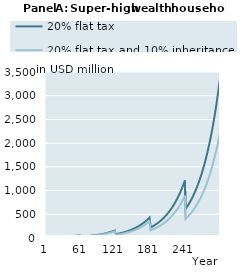
| Category | 20% flat tax | 20% flat tax and 10% inheritance tax |
|---|---|---|
| 1 | 10000000 | 10000000 |
| 2 | 10314750 | 10314750 |
| 3 | 10638690.7 | 10638690.7 |
| 4 | 10972090.468 | 10972090.468 |
| 5 | 11315225.51 | 11315225.51 |
| 6 | 11668380.095 | 11668380.095 |
| 7 | 12031846.794 | 12031846.794 |
| 8 | 12405926.72 | 12405926.72 |
| 9 | 12790929.78 | 12790929.78 |
| 10 | 13187174.93 | 13187174.93 |
| 11 | 13594990.438 | 13594990.438 |
| 12 | 14014714.159 | 14014714.159 |
| 13 | 14446693.812 | 14446693.812 |
| 14 | 14891287.271 | 14891287.271 |
| 15 | 15348862.86 | 15348862.86 |
| 16 | 15819799.655 | 15819799.655 |
| 17 | 16304487.805 | 16304487.805 |
| 18 | 16803328.849 | 16803328.849 |
| 19 | 17316736.052 | 17316736.052 |
| 20 | 17845134.744 | 17845134.744 |
| 21 | 18388962.679 | 18388962.679 |
| 22 | 18948670.389 | 18948670.389 |
| 23 | 19524721.564 | 19524721.564 |
| 24 | 20117593.434 | 20117593.434 |
| 25 | 20727777.162 | 20727777.162 |
| 26 | 21355778.255 | 21355778.255 |
| 27 | 22002116.981 | 22002116.981 |
| 28 | 22667328.796 | 22667328.796 |
| 29 | 23351964.797 | 23351964.797 |
| 30 | 24056592.169 | 24056592.169 |
| 31 | 24781794.661 | 24781794.661 |
| 32 | 25528173.065 | 25528173.065 |
| 33 | 26296345.718 | 26296345.718 |
| 34 | 27086949.013 | 27086949.013 |
| 35 | 27900637.924 | 27900637.924 |
| 36 | 28738086.552 | 28738086.552 |
| 37 | 29599988.679 | 29599988.679 |
| 38 | 30487058.349 | 30487058.349 |
| 39 | 31400030.452 | 31400030.452 |
| 40 | 32339661.341 | 32339661.341 |
| 41 | 33306729.453 | 33306729.453 |
| 42 | 34290485.953 | 34290485.953 |
| 43 | 35302968.142 | 35302968.142 |
| 44 | 36345014.812 | 36345014.812 |
| 45 | 37417489.245 | 37417489.245 |
| 46 | 38521279.931 | 38521279.931 |
| 47 | 39657301.305 | 39657301.305 |
| 48 | 40826494.503 | 40826494.503 |
| 49 | 42029828.142 | 42029828.142 |
| 50 | 43268299.124 | 43268299.124 |
| 51 | 44542933.458 | 44542933.458 |
| 52 | 45854787.115 | 45854787.115 |
| 53 | 47204946.899 | 47204946.899 |
| 54 | 48594531.349 | 48594531.349 |
| 55 | 50024691.664 | 50024691.664 |
| 56 | 51496612.661 | 51496612.661 |
| 57 | 53011513.75 | 53011513.75 |
| 58 | 54570649.952 | 54570649.952 |
| 59 | 56175312.93 | 56175312.93 |
| 60 | 57826832.068 | 57826832.068 |
| 61 | 28913416.034 | 26022074.431 |
| 62 | 29780437.782 | 26804669.004 |
| 63 | 30672776.565 | 27610115.339 |
| 64 | 31591171.641 | 28439080.707 |
| 65 | 32536383.853 | 29292251.863 |
| 66 | 33509196.262 | 30170335.618 |
| 67 | 34510414.792 | 31074059.418 |
| 68 | 35540868.904 | 32004171.953 |
| 69 | 36601412.276 | 32961443.774 |
| 70 | 37692923.515 | 33946667.932 |
| 71 | 38816306.881 | 34960660.636 |
| 72 | 39972493.042 | 36004261.926 |
| 73 | 41162439.839 | 37078336.375 |
| 74 | 42387133.083 | 38183773.797 |
| 75 | 43647587.369 | 39321489.992 |
| 76 | 44944846.92 | 40492427.499 |
| 77 | 46279986.45 | 41697556.382 |
| 78 | 47654112.054 | 42937875.029 |
| 79 | 49068362.126 | 44214410.979 |
| 80 | 50523908.3 | 45528221.78 |
| 81 | 52021956.423 | 46880395.856 |
| 82 | 53563747.55 | 48272053.415 |
| 83 | 55150558.979 | 49704347.375 |
| 84 | 56783705.301 | 51178464.318 |
| 85 | 58464539.495 | 52695625.476 |
| 86 | 60194454.049 | 54257087.74 |
| 87 | 61974882.107 | 55864144.702 |
| 88 | 63807298.664 | 57518127.727 |
| 89 | 65693221.785 | 59220407.057 |
| 90 | 67634213.862 | 60972392.943 |
| 91 | 69631882.906 | 62775536.817 |
| 92 | 71687883.887 | 64631332.492 |
| 93 | 73803920.097 | 66541317.401 |
| 94 | 75981744.564 | 68507073.869 |
| 95 | 78223161.505 | 70530230.426 |
| 96 | 80530027.821 | 72612463.154 |
| 97 | 82904254.633 | 74755497.078 |
| 98 | 85347808.868 | 76961107.593 |
| 99 | 87862714.887 | 79231121.935 |
| 100 | 90451056.162 | 81567420.695 |
| 101 | 93114977.002 | 83971939.38 |
| 102 | 95845134.331 | 86435120.01 |
| 103 | 98655012.253 | 88970225.514 |
| 104 | 101546938.611 | 91579356.099 |
| 105 | 104523309.218 | 94264673.297 |
| 106 | 107586589.847 | 97028401.757 |
| 107 | 110739318.271 | 99872831.089 |
| 108 | 113984106.364 | 102800317.756 |
| 109 | 117323642.27 | 105813287.035 |
| 110 | 120760692.625 | 108914235.016 |
| 111 | 124298104.849 | 112105730.679 |
| 112 | 127938809.511 | 115390418.015 |
| 113 | 131685822.748 | 118771018.221 |
| 114 | 135542248.773 | 122250331.953 |
| 115 | 139511282.437 | 125831241.646 |
| 116 | 143596211.884 | 129516713.902 |
| 117 | 147800421.271 | 133309801.948 |
| 118 | 152127393.572 | 137213648.164 |
| 119 | 156580713.464 | 141231486.691 |
| 120 | 161164070.298 | 145366646.102 |
| 121 | 80582035.149 | 65414990.746 |
| 122 | 82957780.575 | 67347858.476 |
| 123 | 85402897.768 | 69337165.943 |
| 124 | 87919412.383 | 71384561.189 |
| 125 | 90509409.224 | 73491740.376 |
| 126 | 93175033.974 | 75660449.194 |
| 127 | 95918494.966 | 77892484.311 |
| 128 | 98742065.019 | 80189694.853 |
| 129 | 101648083.317 | 82553983.943 |
| 130 | 104638957.35 | 84987310.274 |
| 131 | 107717164.905 | 87491689.734 |
| 132 | 110885256.12 | 90069197.074 |
| 133 | 114145855.599 | 92721967.628 |
| 134 | 117501664.582 | 95452199.083 |
| 135 | 120955463.188 | 98262153.296 |
| 136 | 124510112.713 | 101154158.173 |
| 137 | 128168558.004 | 104130609.591 |
| 138 | 131933829.898 | 107193973.391 |
| 139 | 135809047.731 | 110346787.414 |
| 140 | 139797421.925 | 113591663.607 |
| 141 | 143902256.645 | 116931290.184 |
| 142 | 148126952.539 | 120368433.858 |
| 143 | 152475009.553 | 123905942.126 |
| 144 | 156950029.832 | 127546745.636 |
| 145 | 161555720.703 | 131293860.609 |
| 146 | 166295897.748 | 135150391.339 |
| 147 | 171174487.962 | 139119532.766 |
| 148 | 176195533.011 | 143204573.123 |
| 149 | 181363192.574 | 147408896.658 |
| 150 | 186681747.798 | 151735986.44 |
| 151 | 192155604.833 | 156189427.244 |
| 152 | 197789298.494 | 160772908.52 |
| 153 | 203587496.01 | 165490227.449 |
| 154 | 209555000.894 | 170345292.09 |
| 155 | 215696756.92 | 175342124.619 |
| 156 | 222017852.222 | 180484864.658 |
| 157 | 228523523.507 | 185777772.706 |
| 158 | 235219160.393 | 191225233.669 |
| 159 | 242110309.877 | 196831760.492 |
| 160 | 249202680.925 | 202601997.898 |
| 161 | 256502149.208 | 208540726.237 |
| 162 | 264003211.965 | 214641315.443 |
| 163 | 271723305.755 | 220920041.854 |
| 164 | 279668826.283 | 227382107.076 |
| 165 | 287846356.01 | 234032864.603 |
| 166 | 296262669.606 | 240877824.249 |
| 167 | 304924739.558 | 247922656.717 |
| 168 | 313839741.953 | 255173198.294 |
| 169 | 323015062.418 | 262635455.684 |
| 170 | 332458302.241 | 270315610.99 |
| 171 | 342177284.666 | 278220026.831 |
| 172 | 352180061.378 | 286355251.614 |
| 173 | 362474919.171 | 294728024.961 |
| 174 | 373070386.811 | 303345283.29 |
| 175 | 383975242.105 | 312214165.562 |
| 176 | 395198519.175 | 321342019.197 |
| 177 | 406749515.935 | 330736406.157 |
| 178 | 418637801.8 | 340405109.217 |
| 179 | 430873225.613 | 350356138.406 |
| 180 | 443465923.8 | 360597737.647 |
| 181 | 221732961.9 | 162268981.941 |
| 182 | 228230314.388 | 167029986.214 |
| 183 | 234917389.568 | 171930011.811 |
| 184 | 241799727.343 | 176973118.156 |
| 185 | 248883029.382 | 182163483.207 |
| 186 | 256173163.84 | 187505406.916 |
| 187 | 263676170.224 | 193003314.798 |
| 188 | 271398264.394 | 198661761.59 |
| 189 | 279345843.715 | 204485435.029 |
| 190 | 287525492.351 | 210479159.732 |
| 191 | 295943986.728 | 216647901.196 |
| 192 | 304608301.14 | 222996769.911 |
| 193 | 313525613.533 | 229531025.592 |
| 194 | 322703311.449 | 236256081.539 |
| 195 | 332148998.143 | 243177509.12 |
| 196 | 341870498.889 | 250301042.387 |
| 197 | 351875867.456 | 257632582.824 |
| 198 | 362173392.786 | 265178204.243 |
| 199 | 372771605.855 | 272944157.807 |
| 200 | 383679286.746 | 280936877.215 |
| 201 | 394905471.919 | 289162984.029 |
| 202 | 406459461.699 | 297629293.163 |
| 203 | 418350827.981 | 306342818.523 |
| 204 | 430589422.158 | 315310778.824 |
| 205 | 443185383.285 | 324540603.566 |
| 206 | 456149146.477 | 334039939.19 |
| 207 | 469491451.554 | 343816655.414 |
| 208 | 483223351.939 | 353878851.752 |
| 209 | 497356223.816 | 364234864.223 |
| 210 | 511901775.551 | 374893272.259 |
| 211 | 526872057.398 | 385862905.809 |
| 212 | 542279471.474 | 397152852.658 |
| 213 | 558136782.041 | 408772465.956 |
| 214 | 574457126.076 | 420731371.962 |
| 215 | 591254024.158 | 433039478.023 |
| 216 | 608541391.663 | 445706980.781 |
| 217 | 626333550.3 | 458744374.62 |
| 218 | 644645239.968 | 472162460.359 |
| 219 | 663491630.975 | 485972354.202 |
| 220 | 682888336.6 | 500185496.944 |
| 221 | 702851426.029 | 514813663.455 |
| 222 | 723385887.669 | 529857422.428 |
| 223 | 744519955.589 | 545340459.163 |
| 224 | 766271138.292 | 561275600.57 |
| 225 | 788657455.53 | 577676048.107 |
| 226 | 811697453.231 | 594555388.712 |
| 227 | 835410218.866 | 611927606.062 |
| 228 | 859815397.257 | 629807092.159 |
| 229 | 884933206.856 | 648208659.25 |
| 230 | 910784456.497 | 667147552.1 |
| 231 | 937390562.626 | 686639460.622 |
| 232 | 964773567.055 | 706700532.872 |
| 233 | 992956155.213 | 727347388.432 |
| 234 | 1021961674.945 | 748597132.174 |
| 235 | 1051814155.854 | 770467368.433 |
| 236 | 1082538329.205 | 792976215.592 |
| 237 | 1114159648.417 | 816142321.087 |
| 238 | 1146704310.151 | 839984876.863 |
| 239 | 1180199276.008 | 864523635.267 |
| 240 | 1214672294.867 | 889778925.417 |
| 241 | 607336147.433 | 400400516.438 |
| 242 | 625093112.939 | 412114961.518 |
| 243 | 643368581.836 | 424171468.394 |
| 244 | 662177694.426 | 436580025.271 |
| 245 | 681536033.103 | 449350912.009 |
| 246 | 701459635.27 | 462494708.64 |
| 247 | 721965006.62 | 476022304.132 |
| 248 | 743069134.813 | 489944905.412 |
| 249 | 764789503.55 | 504274046.651 |
| 250 | 787144107.053 | 519021598.813 |
| 251 | 810151464.979 | 534199779.498 |
| 252 | 833830637.757 | 549821163.059 |
| 253 | 858201242.379 | 565898691.021 |
| 254 | 883283468.656 | 582445682.799 |
| 255 | 909098095.941 | 599475846.736 |
| 256 | 935666510.343 | 617003291.461 |
| 257 | 963010722.445 | 635042537.572 |
| 258 | 991153385.54 | 653608529.669 |
| 259 | 1020117814.398 | 672716648.735 |
| 260 | 1049928004.578 | 692382724.878 |
| 261 | 1080608652.312 | 712623050.445 |
| 262 | 1112185174.96 | 733454393.518 |
| 263 | 1144683732.068 | 754894011.808 |
| 264 | 1178131247.045 | 776959666.953 |
| 265 | 1212555429.458 | 799669639.228 |
| 266 | 1247984797.999 | 823042742.694 |
| 267 | 1284448704.1 | 847098340.78 |
| 268 | 1321977356.26 | 871856362.331 |
| 269 | 1360601845.063 | 897337318.111 |
| 270 | 1400354168.939 | 923562317.8 |
| 271 | 1441267260.672 | 950553087.48 |
| 272 | 1483375014.683 | 978331987.634 |
| 273 | 1526712315.112 | 1006922031.673 |
| 274 | 1571315064.713 | 1036346904.998 |
| 275 | 1617220214.603 | 1066630984.624 |
| 276 | 1664465794.869 | 1097799359.375 |
| 277 | 1713090946.079 | 1129877850.668 |
| 278 | 1763135951.705 | 1162893033.908 |
| 279 | 1814642271.495 | 1196872260.498 |
| 280 | 1867652575.822 | 1231843680.505 |
| 281 | 1922210781.036 | 1267836265.975 |
| 282 | 1978350535.843 | 1304868284.942 |
| 283 | 2036129571.489 | 1342981638.862 |
| 284 | 2095595754.977 | 1382207902.717 |
| 285 | 2156798351.022 | 1422579573.476 |
| 286 | 2219788062.872 | 1464130097.022 |
| 287 | 2284617074.308 | 1506893895.855 |
| 288 | 2351339092.878 | 1550906397.614 |
| 289 | 2420009394.39 | 1596204064.424 |
| 290 | 2490684868.706 | 1642824423.105 |
| 291 | 2563424066.872 | 1690806096.26 |
| 292 | 2638287249.625 | 1740188834.271 |
| 293 | 2715336437.314 | 1791013548.231 |
| 294 | 2794635461.283 | 1843322343.84 |
| 295 | 2876250016.753 | 1897158556.28 |
| 296 | 2960247717.242 | 1952566786.123 |
| 297 | 3046698150.585 | 2009592936.278 |
| 298 | 3135672936.582 | 2068284250.017 |
| 299 | 3227245786.331 | 2128689350.118 |
| 300 | 3321492563.291 | 2190858279.141 |